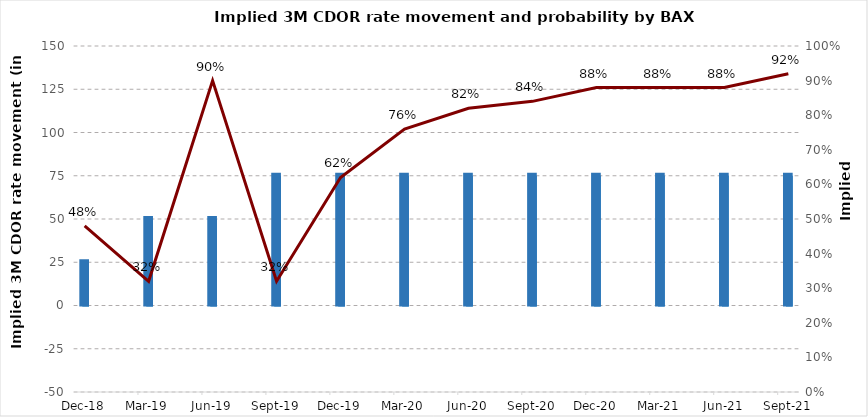
| Category | Series 1 |
|---|---|
| 0 | 25 |
| 1900-01-01 | 50 |
| 1900-01-02 | 50 |
| 1900-01-03 | 75 |
| 1900-01-04 | 75 |
| 1900-01-05 | 75 |
| 1900-01-06 | 75 |
| 1900-01-07 | 75 |
| 1900-01-08 | 75 |
| 1900-01-09 | 75 |
| 1900-01-10 | 75 |
| 1900-01-11 | 75 |